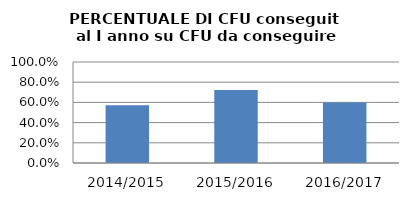
| Category | 2014/2015 2015/2016 2016/2017 |
|---|---|
| 2014/2015 | 0.571 |
| 2015/2016 | 0.722 |
| 2016/2017 | 0.599 |